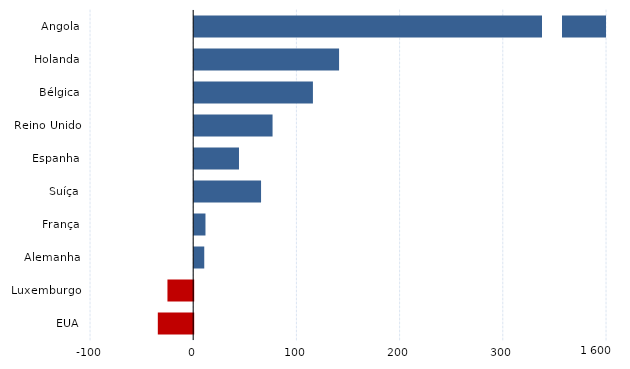
| Category | Series 0 |
|---|---|
| Angola | 1619.398 |
| Holanda | 140.378 |
| Bélgica | 115.042 |
| Reino Unido | 75.926 |
| Espanha | 43.4 |
| Suíça | 64.787 |
| França | 10.925 |
| Alemanha | 9.747 |
| Luxemburgo | -24.947 |
| EUA | -34.289 |